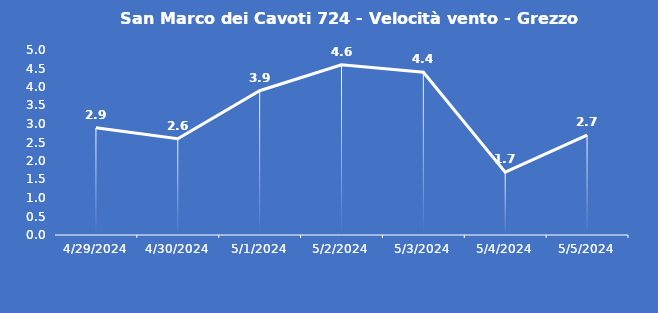
| Category | San Marco dei Cavoti 724 - Velocità vento - Grezzo (m/s) |
|---|---|
| 4/29/24 | 2.9 |
| 4/30/24 | 2.6 |
| 5/1/24 | 3.9 |
| 5/2/24 | 4.6 |
| 5/3/24 | 4.4 |
| 5/4/24 | 1.7 |
| 5/5/24 | 2.7 |